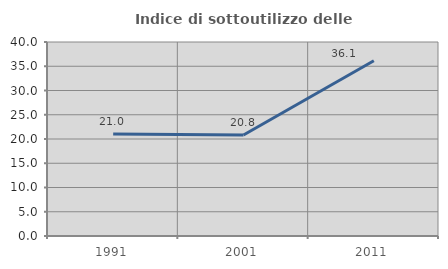
| Category | Indice di sottoutilizzo delle abitazioni  |
|---|---|
| 1991.0 | 21.027 |
| 2001.0 | 20.811 |
| 2011.0 | 36.134 |